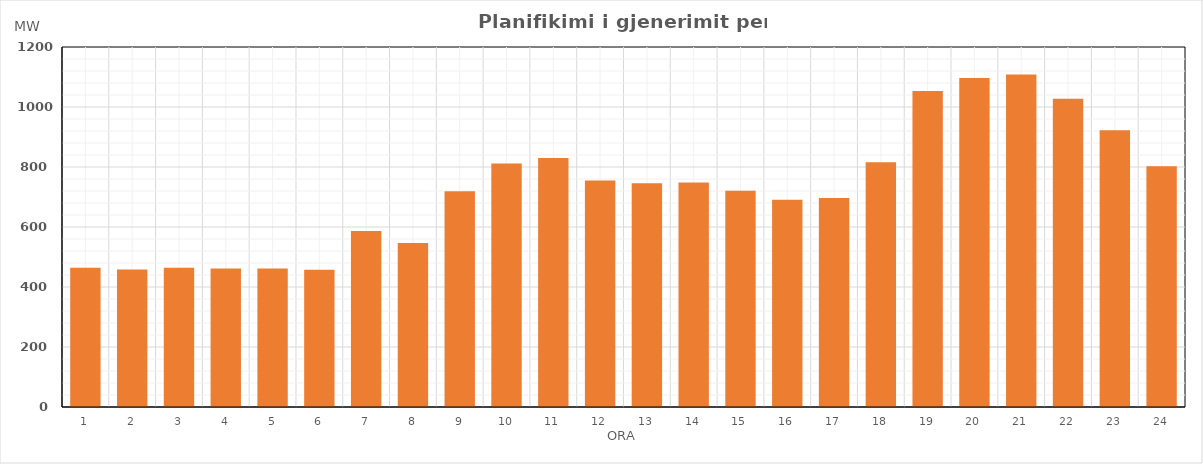
| Category | Max (MW) |
|---|---|
| 0 | 463.809 |
| 1 | 458.414 |
| 2 | 464.295 |
| 3 | 461.613 |
| 4 | 461.671 |
| 5 | 457.671 |
| 6 | 586.301 |
| 7 | 546.526 |
| 8 | 719.36 |
| 9 | 811.834 |
| 10 | 829.96 |
| 11 | 755.25 |
| 12 | 745.856 |
| 13 | 748.232 |
| 14 | 720.678 |
| 15 | 690.979 |
| 16 | 696.73 |
| 17 | 815.762 |
| 18 | 1053.179 |
| 19 | 1096.279 |
| 20 | 1108.532 |
| 21 | 1027.246 |
| 22 | 922.724 |
| 23 | 802.42 |